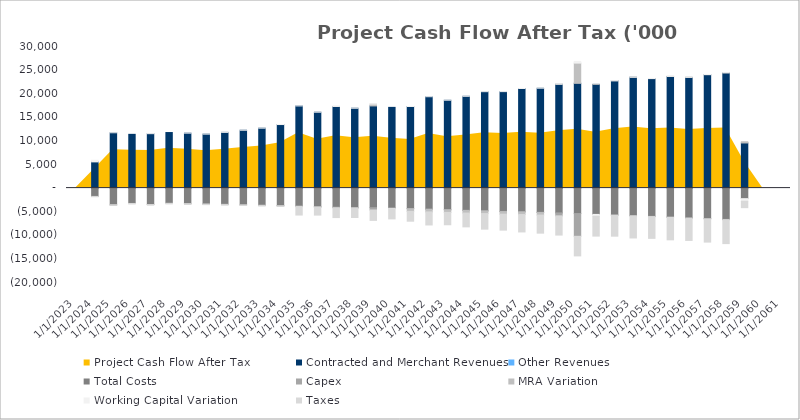
| Category | Contracted and Merchant Revenues | Other Revenues | Total Costs | Capex | MRA Variation | Working Capital Variation | Taxes |
|---|---|---|---|---|---|---|---|
| 12/31/23 | 0 | 0 | 0 | 0 | 0 | 0 | 0 |
| 12/31/24 | 5553.81 | 0 | -1761.831 | 0 | 0 | 341.543 | -67.636 |
| 12/31/25 | 11726.436 | 0 | -3556.059 | 0 | -3.586 | 3.454 | -67.636 |
| 12/31/26 | 11388.921 | 0 | -3253.143 | 0 | -7.262 | -24.897 | -67.636 |
| 12/31/27 | 11530.444 | 0 | -3491.581 | 0 | -11.03 | 19.598 | -67.636 |
| 12/31/28 | 11772.12 | 0 | -3226.893 | 0 | -23.381 | -22.48 | -67.636 |
| 12/31/29 | 11647.086 | 0 | -3303.584 | 0 | -27.34 | 7.028 | -67.636 |
| 12/31/30 | 11437.424 | 0 | -3360.098 | 0 | -75.987 | 4.645 | -67.636 |
| 12/31/31 | 11805.485 | 0 | -3434.343 | 0 | -80.146 | 6.102 | -67.636 |
| 12/31/32 | 12262.615 | 0 | -3533.233 | 0 | -84.409 | 7.334 | -67.636 |
| 12/31/33 | 12701.744 | 0 | -3618.376 | 0 | -88.779 | 7.791 | -67.636 |
| 12/31/34 | 13466.183 | 0 | -3713.719 | -35.864 | -57.394 | 10.784 | -67.636 |
| 12/31/35 | 17408.987 | 0 | -3824.907 | -36.761 | -57.502 | 9.212 | -1790.36 |
| 12/31/36 | 16083.955 | 0 | -3953.074 | -37.68 | -57.612 | 9.714 | -1672.241 |
| 12/31/37 | 17284.629 | 0 | -4045.249 | -123.504 | 27.157 | 15.526 | -2073.651 |
| 12/31/38 | 16921.278 | 0 | -4149.982 | -39.587 | -49.354 | 1.711 | -1992.184 |
| 12/31/39 | 17409.245 | 0 | -4152.179 | -486.475 | 396.425 | 36.911 | -2201.544 |
| 12/31/40 | 17102.682 | 0 | -4239.293 | -41.591 | -62.084 | -30.367 | -2150.415 |
| 12/31/41 | 17282.625 | 0 | -4345.493 | -42.631 | -538.328 | 9.776 | -2084.207 |
| 12/31/42 | 19360.669 | 0 | -4458.478 | -43.697 | -538.457 | 9.374 | -2772.43 |
| 12/31/43 | 18626.202 | 0 | -4570.717 | -44.789 | -538.588 | 9.315 | -2613.442 |
| 12/31/44 | 19451.939 | 0 | -4702.276 | -45.909 | -538.723 | 9.839 | -2926.361 |
| 12/31/45 | 20429.44 | 0 | -4812.456 | -47.057 | -538.861 | 10.216 | -3298.926 |
| 12/31/46 | 20442.408 | 0 | -4939.81 | -48.233 | -539.002 | 10.564 | -3376.388 |
| 12/31/47 | 21106.081 | 0 | -5012.582 | -49.439 | -539.148 | 6.08 | -3688.762 |
| 12/31/48 | 21167.058 | 0 | -5133.983 | -50.675 | -539.296 | 8.915 | -3817.808 |
| 12/31/49 | 22004.974 | 0 | -5256.821 | -622.729 | 31.339 | 58.279 | -4071.283 |
| 12/31/50 | 22193.393 | 0 | -5397.597 | -4814.434 | 4285.317 | 356.094 | -4149.568 |
| 12/31/51 | 21973.425 | 0 | -5535.353 | -54.571 | 6.897 | -379.899 | -4197.442 |
| 12/31/52 | 22734.963 | 0 | -5694.086 | -55.935 | 13.719 | 11.867 | -4435.429 |
| 12/31/53 | 23489.815 | 0 | -5828.492 | -57.334 | 20.711 | 12.453 | -4678.373 |
| 12/31/54 | 23191.867 | 0 | -5981.803 | -58.767 | 27.877 | 12.719 | -4606.399 |
| 12/31/55 | 23648.279 | 0 | -6134.031 | -60.236 | 35.223 | 12.633 | -4766.112 |
| 12/31/56 | 23448.363 | 0 | -6310.622 | -61.742 | 42.753 | 13.207 | -4717.525 |
| 12/31/57 | 24015.433 | 0 | -6460.526 | -63.286 | 50.47 | 13.879 | -4915.248 |
| 12/31/58 | 24396.36 | 0 | -6630.019 | -64.868 | 58.381 | 14.061 | -5063.565 |
| 12/31/59 | 9561.215 | 0 | -2236.537 | 0 | 253.602 | -550.265 | -1353.55 |
| 12/31/60 | 0 | 0 | 0 | 0 | 0 | 0 | 0 |
| 12/31/61 | 0 | 0 | 0 | 0 | 0 | 0 | 0 |
| 12/31/62 | 0 | 0 | 0 | 0 | 0 | 0 | 0 |
| 12/31/63 | 0 | 0 | 0 | 0 | 0 | 0 | 0 |
| 12/31/64 | 0 | 0 | 0 | 0 | 0 | 0 | 0 |
| 12/31/65 | 0 | 0 | 0 | 0 | 0 | 0 | 0 |
| 12/31/66 | 0 | 0 | 0 | 0 | 0 | 0 | 0 |
| 12/31/67 | 0 | 0 | 0 | 0 | 0 | 0 | 0 |
| 12/31/68 | 0 | 0 | 0 | 0 | 0 | 0 | 0 |
| 12/31/69 | 0 | 0 | 0 | 0 | 0 | 0 | 0 |
| 12/31/70 | 0 | 0 | 0 | 0 | 0 | 0 | 0 |
| 12/31/71 | 0 | 0 | 0 | 0 | 0 | 0 | 0 |
| 12/31/72 | 0 | 0 | 0 | 0 | 0 | 0 | 0 |
| 12/31/73 | 0 | 0 | 0 | 0 | 0 | 0 | 0 |
| 12/31/74 | 0 | 0 | 0 | 0 | 0 | 0 | 0 |
| 12/31/75 | 0 | 0 | 0 | 0 | 0 | 0 | 0 |
| 12/31/76 | 0 | 0 | 0 | 0 | 0 | 0 | 0 |
| 12/31/77 | 0 | 0 | 0 | 0 | 0 | 0 | 0 |
| 12/31/78 | 0 | 0 | 0 | 0 | 0 | 0 | 0 |
| 12/31/79 | 0 | 0 | 0 | 0 | 0 | 0 | 0 |
| 12/31/80 | 0 | 0 | 0 | 0 | 0 | 0 | 0 |
| 12/31/81 | 0 | 0 | 0 | 0 | 0 | 0 | 0 |
| 12/31/82 | 0 | 0 | 0 | 0 | 0 | 0 | 0 |